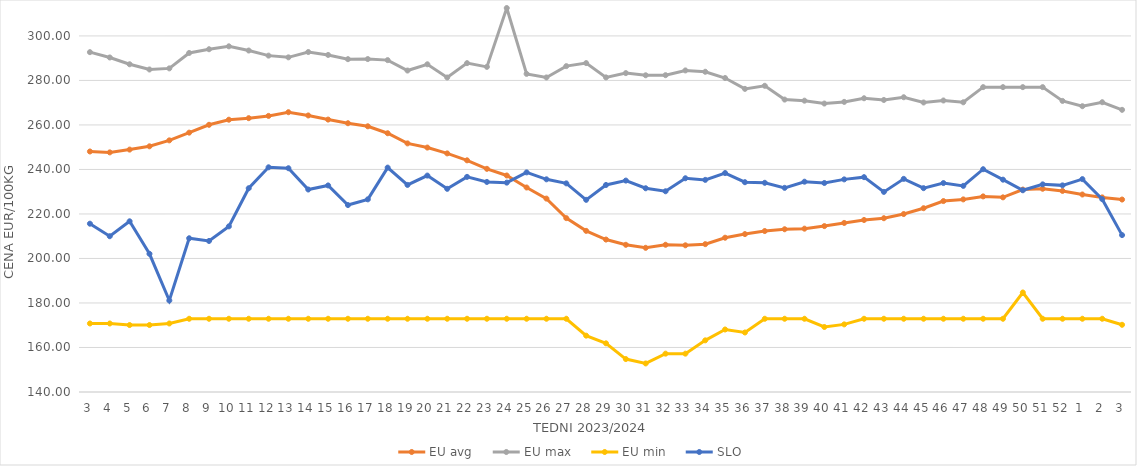
| Category | EU avg | EU max | EU min | SLO |
|---|---|---|---|---|
| 3.0 | 248.079 | 292.71 | 170.79 | 215.63 |
| 4.0 | 247.672 | 290.32 | 170.79 | 210 |
| 5.0 | 248.924 | 287.27 | 170.09 | 216.7 |
| 6.0 | 250.4 | 284.92 | 170.09 | 202.1 |
| 7.0 | 253.074 | 285.42 | 170.79 | 181.11 |
| 8.0 | 256.543 | 292.35 | 172.91 | 209.08 |
| 9.0 | 260.066 | 294.02 | 172.91 | 207.87 |
| 10.0 | 262.352 | 295.33 | 172.91 | 214.42 |
| 11.0 | 263.049 | 293.44 | 172.91 | 231.56 |
| 12.0 | 264.068 | 291.15 | 172.91 | 240.97 |
| 13.0 | 265.73 | 290.38 | 172.91 | 240.55 |
| 14.0 | 264.262 | 292.763 | 172.91 | 230.99 |
| 15.0 | 262.411 | 291.46 | 172.91 | 232.82 |
| 16.0 | 260.77 | 289.56 | 172.91 | 224 |
| 17.0 | 259.395 | 289.61 | 172.91 | 226.57 |
| 18.0 | 256.275 | 289.13 | 172.91 | 240.83 |
| 19.0 | 251.716 | 284.45 | 172.91 | 233.05 |
| 20.0 | 249.836 | 287.26 | 172.91 | 237.25 |
| 21.0 | 247.212 | 281.33 | 172.91 | 231.3 |
| 22.0 | 244.103 | 287.77 | 172.91 | 236.67 |
| 23.0 | 240.279 | 286.1 | 172.91 | 234.39 |
| 24.0 | 237.289 | 312.54 | 172.91 | 234.08 |
| 25.0 | 231.895 | 282.95 | 172.91 | 238.69 |
| 26.0 | 226.903 | 281.34 | 172.91 | 235.57 |
| 27.0 | 218.126 | 286.43 | 172.91 | 233.75 |
| 28.0 | 212.406 | 287.8 | 165.32 | 226.35 |
| 29.0 | 208.504 | 281.37 | 161.87 | 233.03 |
| 30.0 | 206.149 | 283.3 | 154.8 | 235 |
| 31.0 | 204.79 | 282.32 | 152.83 | 231.55 |
| 32.0 | 206.16 | 282.36 | 157.23 | 230.2 |
| 33.0 | 205.917 | 284.5 | 157.23 | 236.04 |
| 34.0 | 206.436 | 283.9 | 163.21 | 235.32 |
| 35.0 | 209.326 | 281.09 | 168.085 | 238.39 |
| 36.0 | 210.957 | 276.21 | 166.745 | 234.27 |
| 37.0 | 212.325 | 277.59 | 172.91 | 234 |
| 38.0 | 213.132 | 271.4 | 172.91 | 231.74 |
| 39.0 | 213.398 | 270.91 | 172.91 | 234.5 |
| 40.0 | 214.548 | 269.62 | 169.209 | 233.92 |
| 41.0 | 215.966 | 270.36 | 170.387 | 235.54 |
| 42.0 | 217.294 | 271.99 | 172.91 | 236.54 |
| 43.0 | 218.091 | 271.22 | 172.91 | 229.92 |
| 44.0 | 219.965 | 272.45 | 172.91 | 235.77 |
| 45.0 | 222.584 | 270.09 | 172.91 | 231.6 |
| 46.0 | 225.795 | 270.99 | 172.91 | 233.89 |
| 47.0 | 226.547 | 270.18 | 172.91 | 232.62 |
| 48.0 | 227.89 | 276.99 | 172.91 | 240.11 |
| 49.0 | 227.466 | 276.99 | 172.91 | 235.41 |
| 50.0 | 230.959 | 276.99 | 184.72 | 230.65 |
| 51.0 | 231.331 | 276.99 | 172.91 | 233.3 |
| 52.0 | 230.35 | 270.79 | 172.91 | 232.85 |
| 1.0 | 228.749 | 268.42 | 172.91 | 235.66 |
| 2.0 | 227.446 | 270.21 | 172.91 | 226.65 |
| 3.0 | 226.477 | 266.79 | 170.2 | 210.5 |